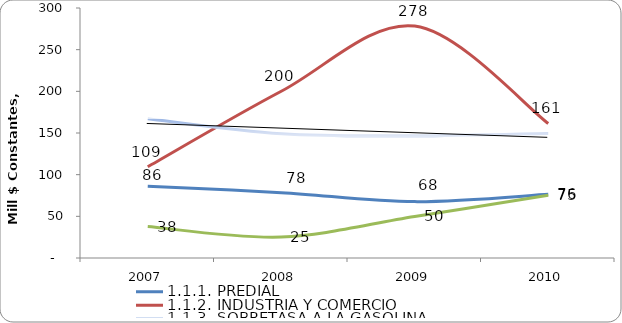
| Category | 1.1.1. PREDIAL | 1.1.2. INDUSTRIA Y COMERCIO | 1.1.3. SOBRETASA A LA GASOLINA | 1.1.4. OTROS |
|---|---|---|---|---|
| 2007 | 86.128 | 109.477 | 167.231 | 37.707 |
| 2008 | 78.401 | 200.062 | 149.065 | 25.176 |
| 2009 | 67.658 | 278.266 | 146.685 | 49.815 |
| 2010 | 76.381 | 161.497 | 149.508 | 75.306 |